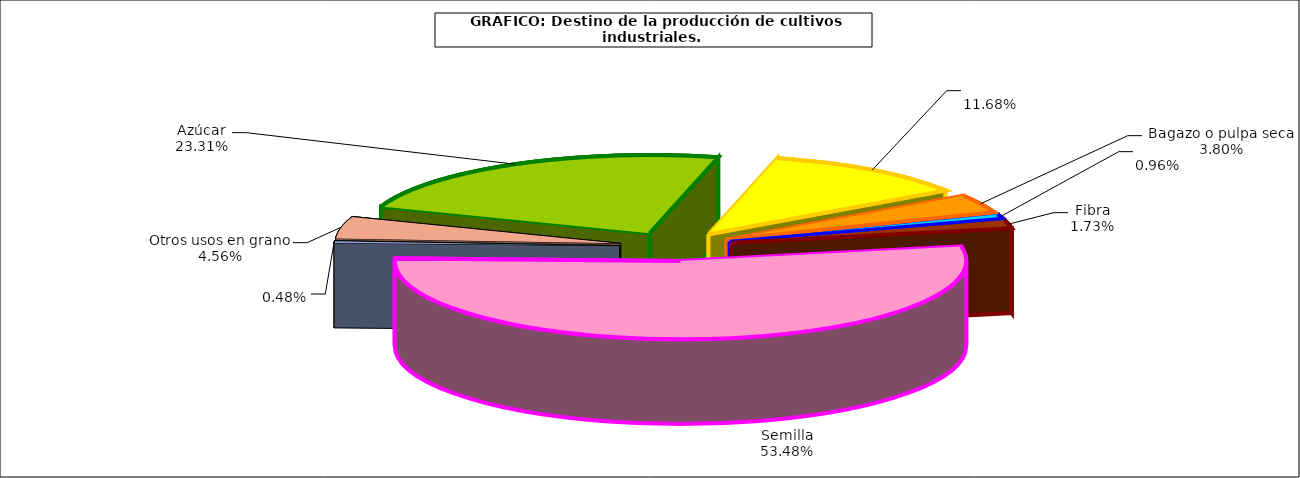
| Category | Series 0 |
|---|---|
|  Azúcar  | 357838 |
|  Bagazo o pulpa seca  | 179306 |
| Fibra | 58330 |
| Semilla | 14683 |
| Otros usos en grano | 26625 |
| Molturación | 821026 |
| Pimentón | 7439 |
| Bio-combustible  | 69972 |